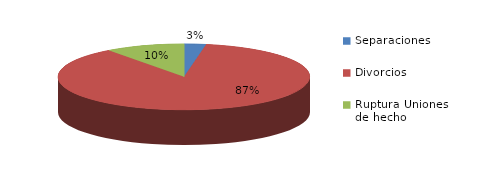
| Category | Series 0 |
|---|---|
| Separaciones | 98 |
| Divorcios | 3048 |
| Ruptura Uniones de hecho | 354 |